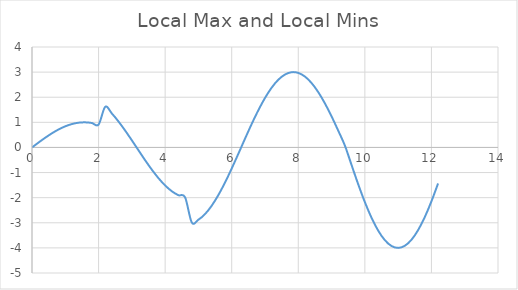
| Category | y |
|---|---|
| 0.0 | 0 |
| 0.2 | 0.199 |
| 0.4 | 0.389 |
| 0.6 | 0.565 |
| 0.8 | 0.717 |
| 1.0 | 0.841 |
| 1.2 | 0.932 |
| 1.4 | 0.985 |
| 1.6 | 1 |
| 1.8 | 0.974 |
| 2.0 | 0.909 |
| 2.2 | 1.617 |
| 2.4 | 1.351 |
| 2.6 | 1.031 |
| 2.8 | 0.67 |
| 3.0 | 0.282 |
| 3.2 | -0.117 |
| 3.4 | -0.511 |
| 3.6 | -0.885 |
| 3.8 | -1.224 |
| 4.0 | -1.514 |
| 4.2 | -1.743 |
| 4.4 | -1.903 |
| 4.6 | -1.987 |
| 4.8 | -2.988 |
| 5.0 | -2.877 |
| 5.2 | -2.65 |
| 5.4 | -2.318 |
| 5.6 | -1.894 |
| 5.8 | -1.394 |
| 6.0 | -0.838 |
| 6.2 | -0.249 |
| 6.4 | 0.35 |
| 6.6 | 0.935 |
| 6.8 | 1.482 |
| 7.0 | 1.971 |
| 7.2 | 2.381 |
| 7.4 | 2.696 |
| 7.6 | 2.904 |
| 7.8 | 2.996 |
| 8.0 | 2.968 |
| 8.2 | 2.822 |
| 8.4 | 2.564 |
| 8.6 | 2.203 |
| 8.8 | 1.755 |
| 9.0 | 1.236 |
| 9.2 | 0.669 |
| 9.4 | 0.074 |
| 9.6 | -0.697 |
| 9.8 | -1.466 |
| 10.0 | -2.176 |
| 10.2 | -2.799 |
| 10.4 | -3.311 |
| 10.6 | -3.691 |
| 10.8 | -3.924 |
| 11.0 | -4 |
| 11.2 | -3.917 |
| 11.4 | -3.677 |
| 11.6 | -3.291 |
| 11.8 | -2.774 |
| 12.0 | -2.146 |
| 12.2 | -1.433 |